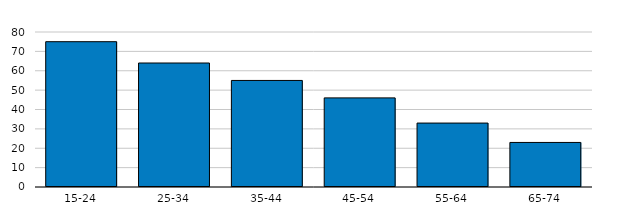
| Category | 2019 |
|---|---|
| 15-24 | 75 |
| 25-34 | 64 |
| 35-44 | 55 |
| 45-54 | 46 |
| 55-64 | 33 |
| 65-74 | 23 |